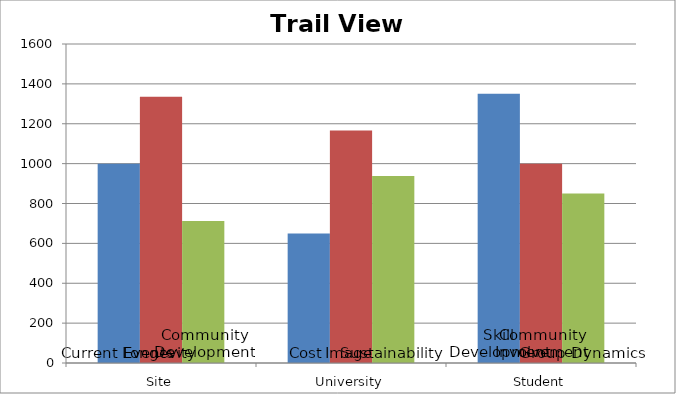
| Category | Alignment1 | Alignment2 | Alignment3 |
|---|---|---|---|
| 0 | 1000 | 1335 | 712.5 |
| 1 | 650 | 1166.25 | 937.5 |
| 2 | 1350 | 1000 | 850 |